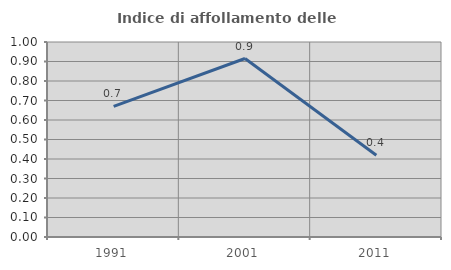
| Category | Indice di affollamento delle abitazioni  |
|---|---|
| 1991.0 | 0.67 |
| 2001.0 | 0.915 |
| 2011.0 | 0.419 |